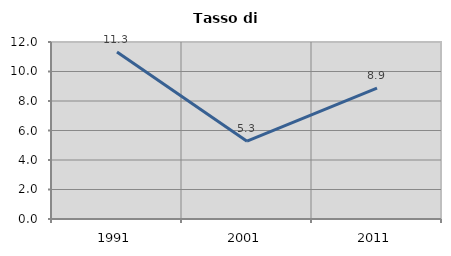
| Category | Tasso di disoccupazione   |
|---|---|
| 1991.0 | 11.326 |
| 2001.0 | 5.277 |
| 2011.0 | 8.876 |